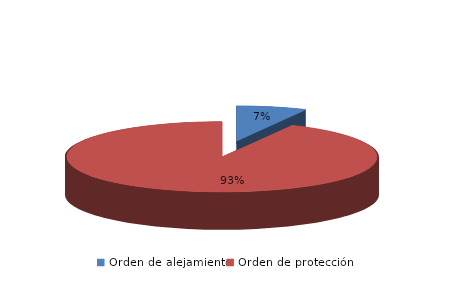
| Category | Series 0 |
|---|---|
| Orden de alejamiento | 45 |
| Orden de protección | 573 |